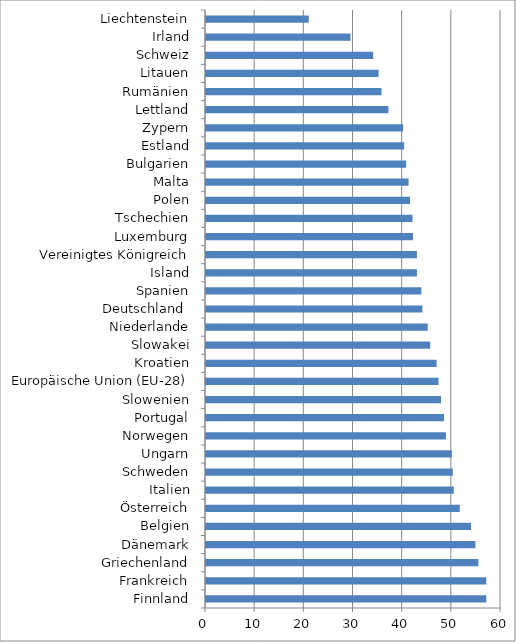
| Category | Series 0 |
|---|---|
| Finnland | 57 |
| Frankreich | 57 |
| Griechenland | 55.4 |
| Dänemark | 54.8 |
| Belgien | 53.9 |
| Österreich | 51.6 |
| Italien | 50.4 |
| Schweden | 50.2 |
| Ungarn | 50 |
| Norwegen | 48.8 |
| Portugal | 48.4 |
| Slowenien | 47.8 |
| Europäische Union (EU-28) | 47.3 |
| Kroatien | 46.9 |
| Slowakei | 45.6 |
| Niederlande | 45.1 |
| Deutschland  | 44 |
| Spanien | 43.8 |
| Island | 42.9 |
| Vereinigtes Königreich | 42.9 |
| Luxemburg | 42.1 |
| Tschechien | 42 |
| Polen | 41.5 |
| Malta | 41.2 |
| Bulgarien | 40.7 |
| Estland | 40.3 |
| Zypern | 40.1 |
| Lettland | 37.1 |
| Rumänien | 35.7 |
| Litauen | 35.1 |
| Schweiz | 34 |
| Irland | 29.4 |
| Liechtenstein | 20.9 |